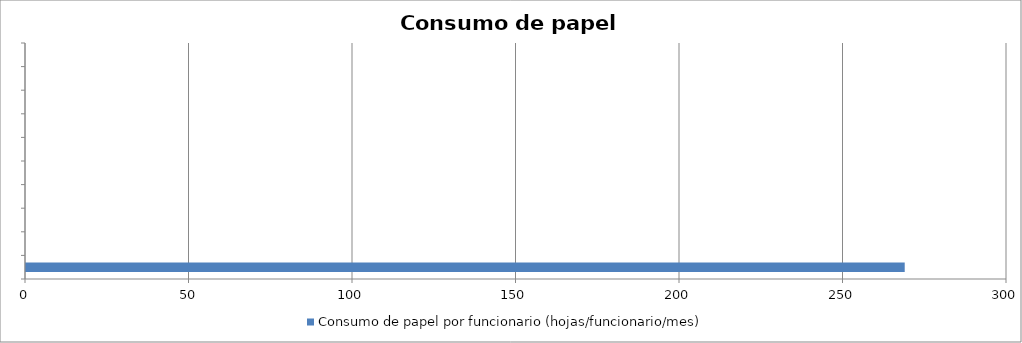
| Category | Consumo de papel por funcionario (hojas/funcionario/mes) |
|---|---|
| 0 | 268.722 |
| 1 | 0 |
| 2 | 0 |
| 3 | 0 |
| 4 | 0 |
| 5 | 0 |
| 6 | 0 |
| 7 | 0 |
| 8 | 0 |
| 9 | 0 |